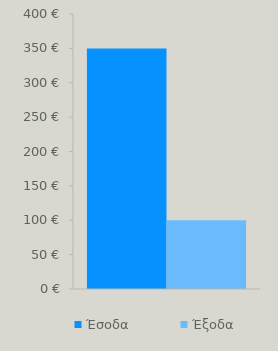
| Category | Έσοδα | Έξοδα |
|---|---|---|
| 0 | 350 | 100 |